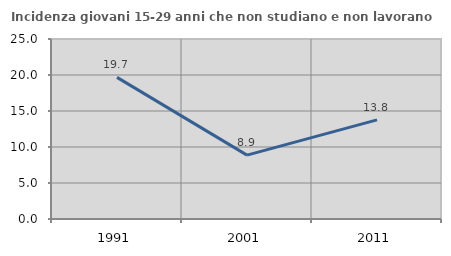
| Category | Incidenza giovani 15-29 anni che non studiano e non lavorano  |
|---|---|
| 1991.0 | 19.665 |
| 2001.0 | 8.874 |
| 2011.0 | 13.773 |